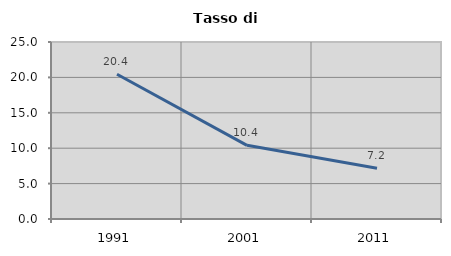
| Category | Tasso di disoccupazione   |
|---|---|
| 1991.0 | 20.45 |
| 2001.0 | 10.407 |
| 2011.0 | 7.181 |